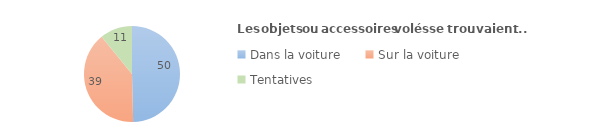
| Category | Series 0 |
|---|---|
| Dans la voiture | 49.532 |
| Sur la voiture | 39.384 |
| Tentatives | 10.895 |